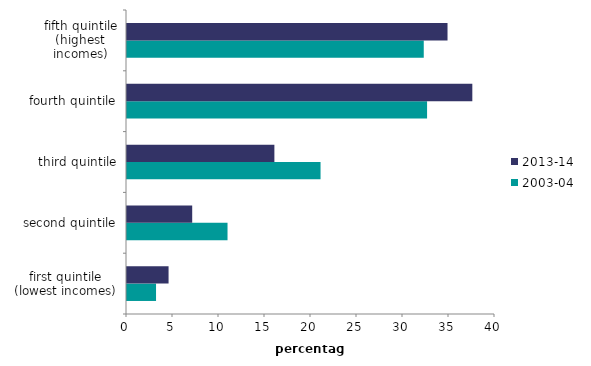
| Category | 2003-04 | 2013-14 |
|---|---|---|
| first quintile (lowest incomes) | 3.156 | 4.518 |
| second quintile | 10.927 | 7.088 |
| third quintile | 21.038 | 16.02 |
| fourth quintile | 32.617 | 37.535 |
| fifth quintile (highest incomes) | 32.256 | 34.839 |